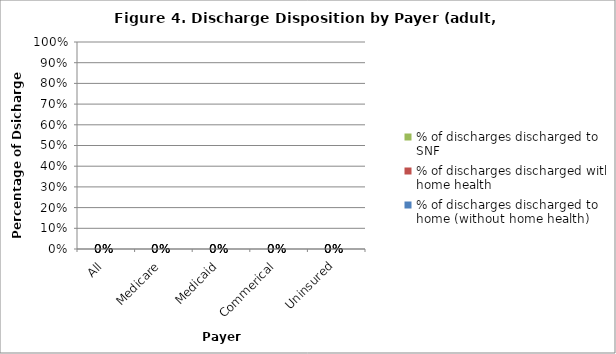
| Category | % of discharges discharged to home (without home health) | % of discharges discharged with home health | % of discharges discharged to SNF |
|---|---|---|---|
| All | 0 | 0 | 0 |
| Medicare | 0 | 0 | 0 |
| Medicaid | 0 | 0 | 0 |
| Commerical | 0 | 0 | 0 |
| Uninsured | 0 | 0 | 0 |